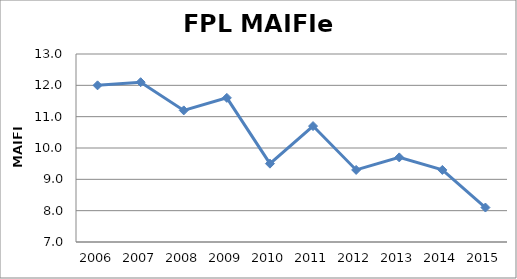
| Category | FPL |
|---|---|
| 2006.0 | 12 |
| 2007.0 | 12.1 |
| 2008.0 | 11.2 |
| 2009.0 | 11.6 |
| 2010.0 | 9.5 |
| 2011.0 | 10.7 |
| 2012.0 | 9.3 |
| 2013.0 | 9.7 |
| 2014.0 | 9.3 |
| 2015.0 | 8.1 |